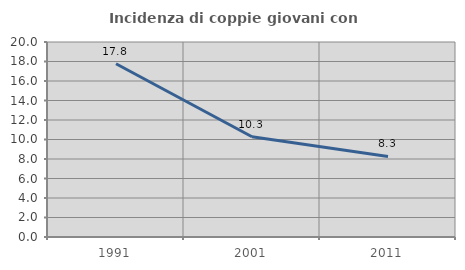
| Category | Incidenza di coppie giovani con figli |
|---|---|
| 1991.0 | 17.771 |
| 2001.0 | 10.278 |
| 2011.0 | 8.262 |